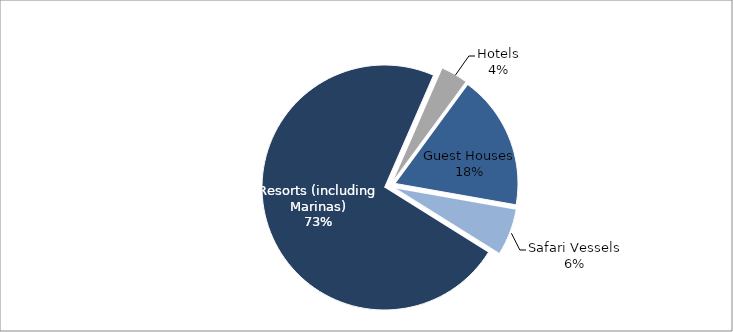
| Category | Series 0 |
|---|---|
| Resorts (including Marinas) | 72.663 |
| Hotels | 3.529 |
| Guest Houses | 17.705 |
| Safari Vessels | 6.104 |